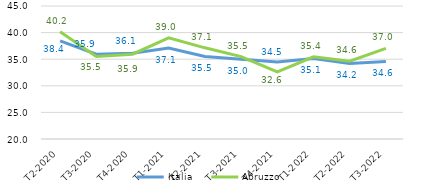
| Category | Italia | Abruzzo |
|---|---|---|
|   T2-2020 | 38.431 | 40.15 |
|   T3-2020 | 35.938 | 35.527 |
|   T4-2020 | 36.104 | 35.935 |
|   T1-2021 | 37.107 | 39.023 |
|   T2-2021 | 35.509 | 37.138 |
|   T3-2021 | 34.983 | 35.478 |
|   T4-2021 | 34.464 | 32.62 |
|   T1-2022 | 35.127 | 35.444 |
|   T2-2022 | 34.205 | 34.625 |
|   T3-2022 | 34.586 | 37.024 |